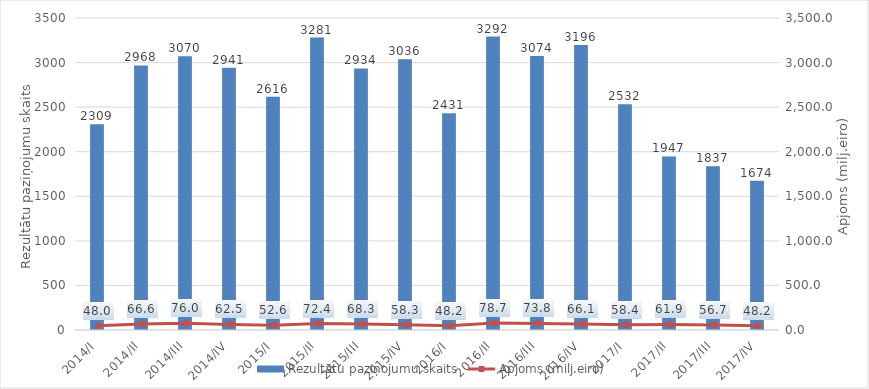
| Category | Rezultātu paziņojumu skaits |
|---|---|
| 2014/I | 2309 |
| 2014/II | 2968 |
| 2014/III | 3070 |
| 2014/IV | 2941 |
| 2015/I | 2616 |
| 2015/II | 3281 |
| 2015/III | 2934 |
| 2015/IV | 3036 |
| 2016/I | 2431 |
| 2016/II | 3292 |
| 2016/III | 3074 |
| 2016/IV | 3196 |
| 2017/I | 2532 |
| 2017/II | 1947 |
| 2017/III | 1837 |
| 2017/IV | 1674 |